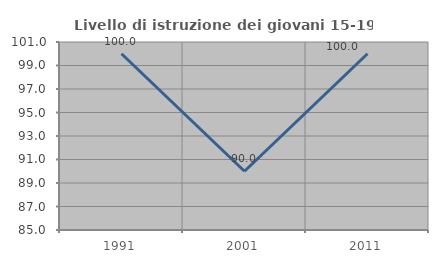
| Category | Livello di istruzione dei giovani 15-19 anni |
|---|---|
| 1991.0 | 100 |
| 2001.0 | 90 |
| 2011.0 | 100 |